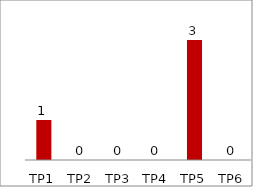
| Category | Series 0 |
|---|---|
| TP1 | 1 |
| TP2 | 0 |
| TP3 | 0 |
| TP4 | 0 |
| TP5 | 3 |
| TP6 | 0 |